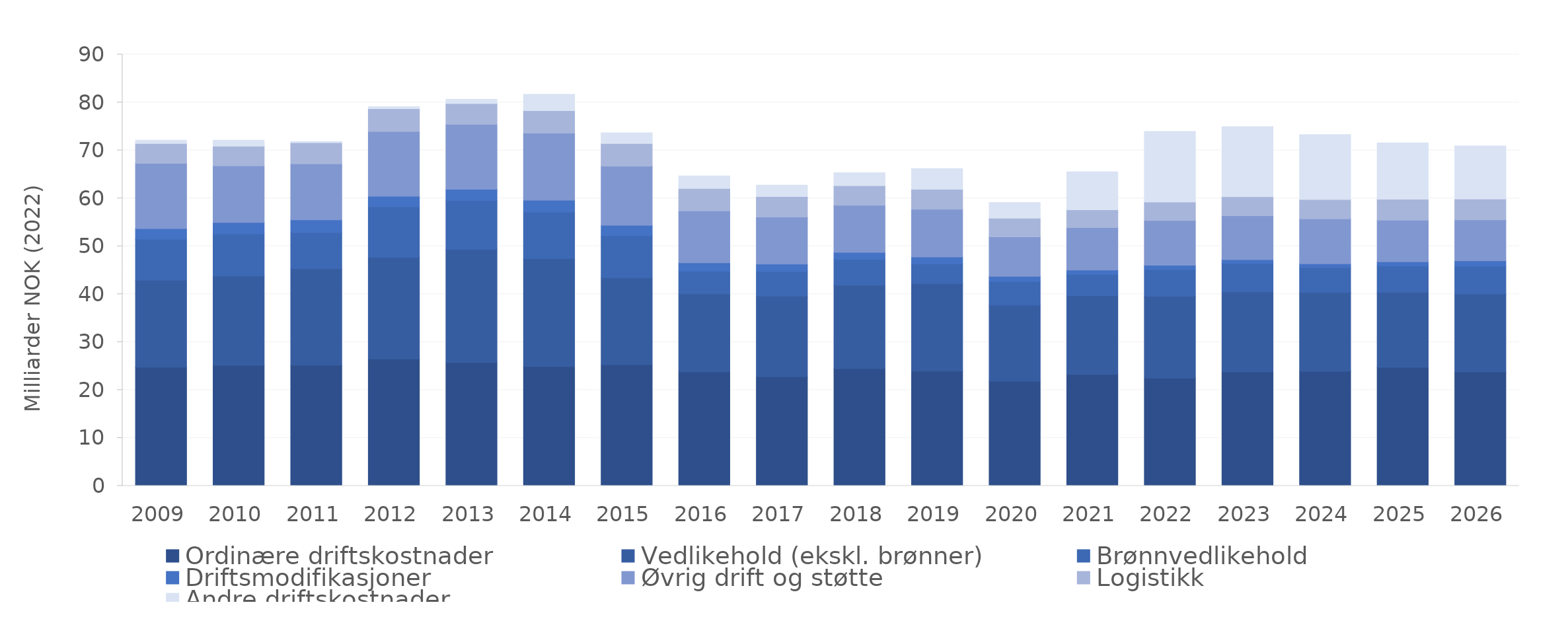
| Category | Ordinære driftskostnader | Vedlikehold (ekskl. brønner) | Brønnvedlikehold | Driftsmodifikasjoner | Øvrig drift og støtte | Logistikk | Andre driftskostnader |
|---|---|---|---|---|---|---|---|
| 2009.0 | 24.774 | 18.14 | 8.567 | 2.205 | 13.614 | 4.137 | 0.684 |
| 2010.0 | 25.15 | 18.637 | 8.795 | 2.374 | 11.823 | 4.088 | 1.262 |
| 2011.0 | 25.191 | 20.135 | 7.529 | 2.658 | 11.683 | 4.415 | 0.221 |
| 2012.0 | 26.473 | 21.206 | 10.562 | 2.201 | 13.507 | 4.745 | 0.429 |
| 2013.0 | 25.752 | 23.602 | 10.136 | 2.381 | 13.557 | 4.328 | 0.919 |
| 2014.0 | 24.928 | 22.483 | 9.702 | 2.489 | 13.98 | 4.689 | 3.425 |
| 2015.0 | 25.288 | 18.129 | 8.757 | 2.182 | 12.336 | 4.747 | 2.222 |
| 2016.0 | 23.811 | 16.273 | 4.709 | 1.764 | 10.828 | 4.664 | 2.613 |
| 2017.0 | 22.766 | 16.834 | 5.108 | 1.583 | 9.795 | 4.29 | 2.373 |
| 2018.0 | 24.472 | 17.409 | 5.362 | 1.471 | 9.826 | 4.115 | 2.657 |
| 2019.0 | 23.931 | 18.285 | 4.105 | 1.432 | 9.975 | 4.147 | 4.306 |
| 2020.0 | 21.852 | 15.888 | 4.88 | 1.098 | 8.249 | 3.89 | 3.277 |
| 2021.0 | 23.264 | 16.416 | 4.456 | 0.91 | 8.842 | 3.724 | 7.923 |
| 2022.0 | 22.48 | 17.071 | 5.537 | 0.931 | 9.347 | 3.879 | 14.705 |
| 2023.0 | 23.758 | 16.74 | 5.921 | 0.8 | 9.167 | 3.951 | 14.6 |
| 2024.0 | 23.903 | 16.438 | 5.204 | 0.809 | 9.347 | 4.055 | 13.541 |
| 2025.0 | 24.733 | 15.645 | 5.49 | 0.904 | 8.653 | 4.378 | 11.76 |
| 2026.0 | 23.788 | 16.224 | 5.8 | 1.162 | 8.535 | 4.353 | 11.047 |